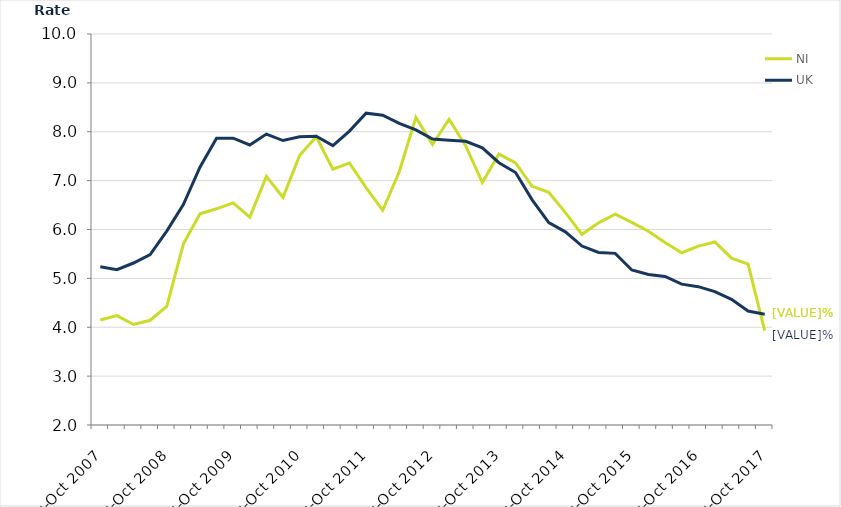
| Category | NI | UK |
|---|---|---|
| Aug-Oct 2007 | 4.148 | 5.239 |
| Nov-Jan 2008 | 4.239 | 5.177 |
| Feb-Apr 2008 | 4.056 | 5.314 |
| May-Jul 2008 | 4.143 | 5.487 |
| Aug-Oct 2008 | 4.424 | 5.968 |
| Nov-Jan 2009 | 5.7 | 6.511 |
| Feb-Apr 2009 | 6.323 | 7.274 |
| May-Jul 2009 | 6.424 | 7.868 |
| Aug-Oct 2009 | 6.545 | 7.868 |
| Nov-Jan 2010 | 6.251 | 7.729 |
| Feb-Apr 2010 | 7.087 | 7.952 |
| May-Jul 2010 | 6.654 | 7.82 |
| Aug-Oct 2010 | 7.514 | 7.897 |
| Nov-Jan 2011 | 7.898 | 7.909 |
| Feb-Apr 2011 | 7.236 | 7.717 |
| May-Jul 2011 | 7.361 | 8.013 |
| Aug-Oct 2011 | 6.855 | 8.38 |
| Nov-Jan 2012 | 6.392 | 8.338 |
| Feb-Apr 2012 | 7.181 | 8.17 |
| May-Jul 2012 | 8.293 | 8.037 |
| Aug-Oct 2012 | 7.739 | 7.851 |
| Nov-Jan 2013 | 8.257 | 7.825 |
| Feb-Apr 2013 | 7.709 | 7.805 |
| May-Jul 2013 | 6.961 | 7.67 |
| Aug-Oct 2013 | 7.542 | 7.366 |
| Nov-Jan 2014 | 7.365 | 7.165 |
| Feb-Apr 2014 | 6.883 | 6.607 |
| May-Jul 2014 | 6.763 | 6.141 |
| Aug-Oct 2014 | 6.345 | 5.952 |
| Nov-Jan 2015 | 5.901 | 5.662 |
| Feb-Apr 2015 | 6.135 | 5.53 |
| May-Jul 2015 | 6.313 | 5.512 |
| Aug-Oct 2015 | 6.146 | 5.172 |
| Nov-Jan 2016 | 5.965 | 5.08 |
| Feb-Apr 2016 | 5.732 | 5.038 |
| May-Jul 2016 | 5.525 | 4.882 |
| Aug-Oct 2016 | 5.661 | 4.83 |
| Nov-Jan 2017 | 5.744 | 4.728 |
| Feb-Apr 2017 | 5.415 | 4.571 |
| May-Jul 2017 | 5.291 | 4.333 |
| Aug-Oct 2017 | 3.93 | 4.265 |